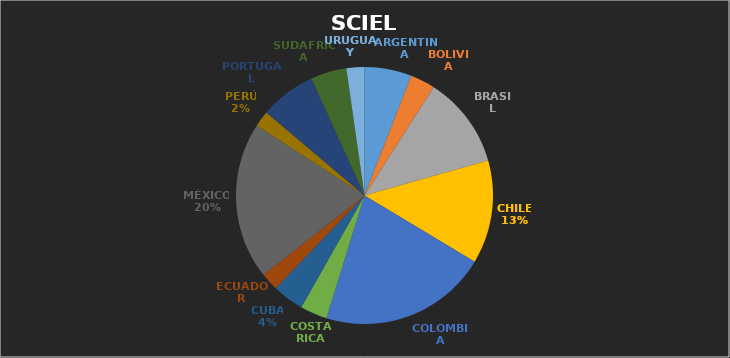
| Category | Series 0 |
|---|---|
| ARGENTINA | 5.932 |
| BOLIVIA | 3.107 |
| BRASIL | 11.582 |
| CHILE | 12.994 |
| COLOMBIA | 21.186 |
| COSTA RICA | 3.39 |
| CUBA | 3.955 |
| ECUADOR | 2.26 |
| MÉXICO | 19.774 |
| PERÚ | 1.977 |
| PORTUGAL | 7.062 |
| SUDAFRICA | 4.52 |
| URUGUAY | 2.26 |